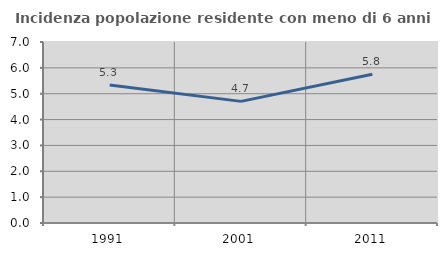
| Category | Incidenza popolazione residente con meno di 6 anni |
|---|---|
| 1991.0 | 5.337 |
| 2001.0 | 4.704 |
| 2011.0 | 5.752 |